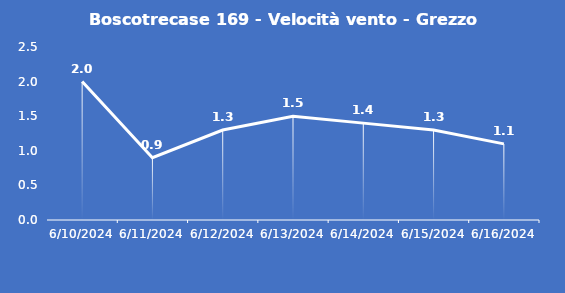
| Category | Boscotrecase 169 - Velocità vento - Grezzo (m/s) |
|---|---|
| 6/10/24 | 2 |
| 6/11/24 | 0.9 |
| 6/12/24 | 1.3 |
| 6/13/24 | 1.5 |
| 6/14/24 | 1.4 |
| 6/15/24 | 1.3 |
| 6/16/24 | 1.1 |